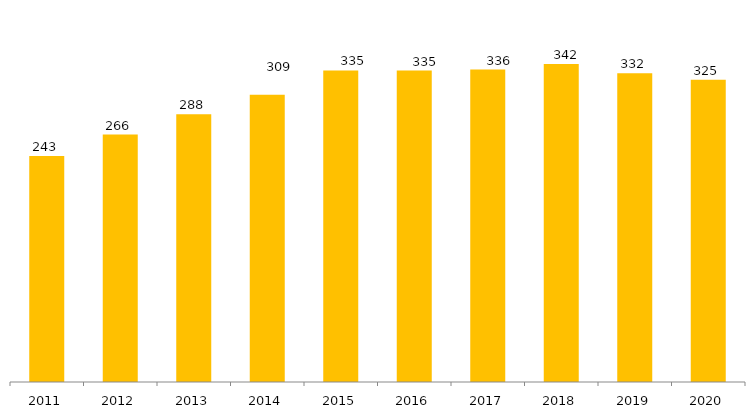
| Category | Categoria/Ano |
|---|---|
| 2011.0 | 243 |
| 2012.0 | 266 |
| 2013.0 | 288 |
| 2014.0 | 309 |
| 2015.0 | 335 |
| 2016.0 | 335 |
| 2017.0 | 336 |
| 2018.0 | 342 |
| 2019.0 | 332 |
| 2020.0 | 325 |